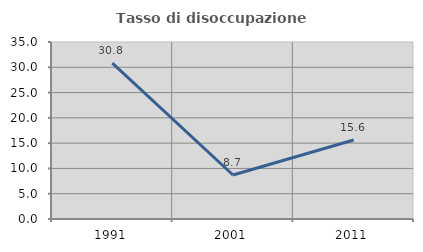
| Category | Tasso di disoccupazione giovanile  |
|---|---|
| 1991.0 | 30.822 |
| 2001.0 | 8.696 |
| 2011.0 | 15.625 |